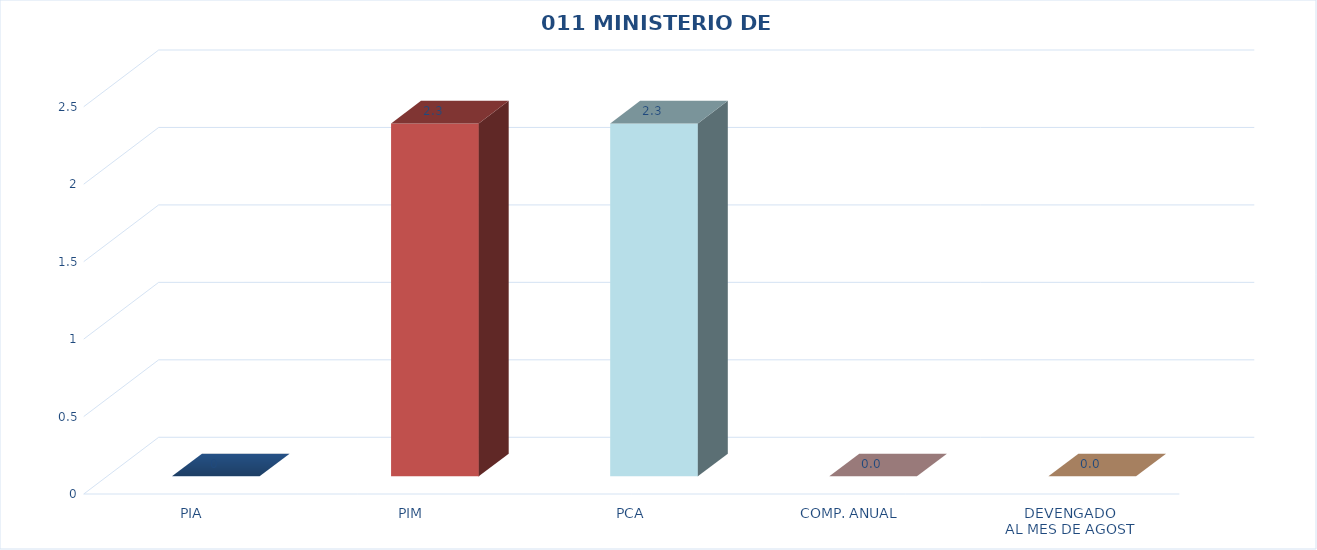
| Category | 011 MINISTERIO DE SALUD |
|---|---|
| PIA | 0 |
| PIM | 2.278 |
| PCA | 2.278 |
| COMP. ANUAL | 0 |
| DEVENGADO
AL MES DE AGOST | 0 |